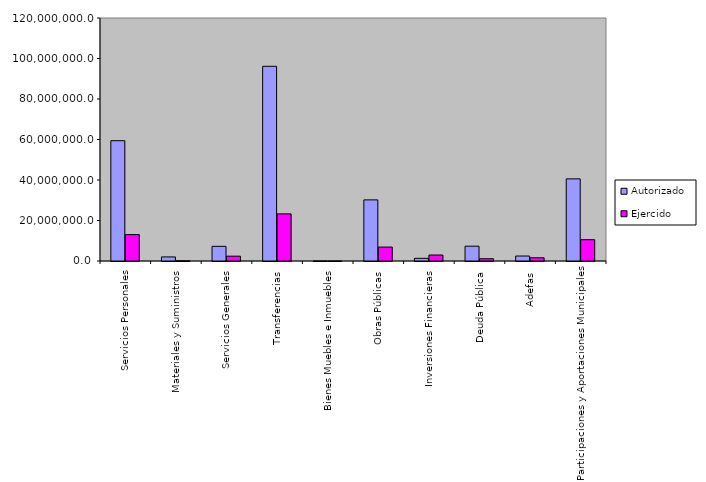
| Category | Autorizado | Ejercido |
|---|---|---|
| 0 | 59412369.7 | 13034640.6 |
| 1 | 2010410.8 | 107158.3 |
| 2 | 7238499.5 | 2390108.8 |
| 3 | 96147175.5 | 23266320.3 |
| 4 | 4024.6 | 14.2 |
| 5 | 30180982.6 | 6875326.3 |
| 6 | 1325299.5 | 2952758.2 |
| 7 | 7312000 | 1114970.2 |
| 8 | 2460661.3 | 1585905.8 |
| 9 | 40558540.8 | 10521316.7 |